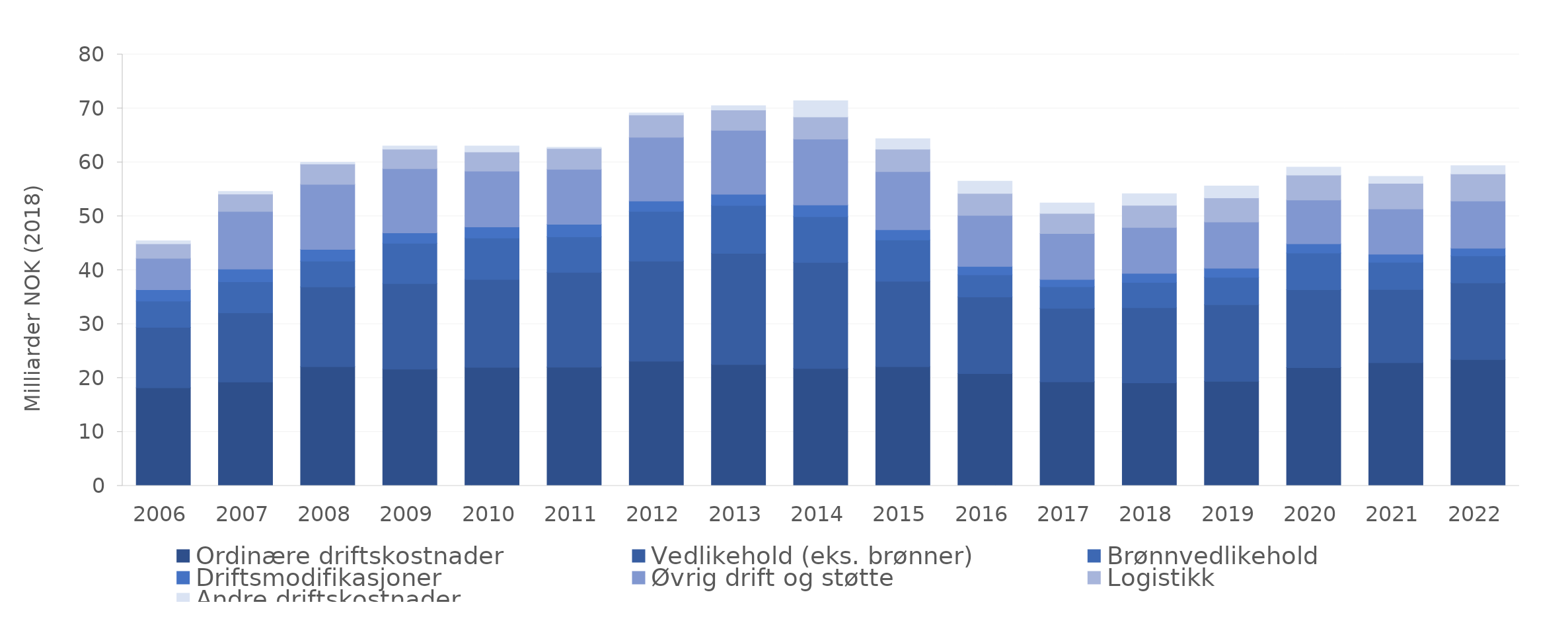
| Category | Ordinære driftskostnader | Vedlikehold (eks. brønner) | Brønnvedlikehold | Driftsmodifikasjoner | Øvrig drift og støtte | Logistikk | Andre driftskostnader |
|---|---|---|---|---|---|---|---|
| 2006.0 | 18.196 | 11.215 | 4.851 | 2.126 | 5.823 | 2.695 | 0.558 |
| 2007.0 | 19.267 | 12.846 | 5.756 | 2.344 | 10.689 | 3.222 | 0.476 |
| 2008.0 | 22.111 | 14.803 | 4.758 | 2.183 | 12.073 | 3.767 | 0.321 |
| 2009.0 | 21.653 | 15.855 | 7.488 | 1.927 | 11.899 | 3.616 | 0.598 |
| 2010.0 | 21.981 | 16.289 | 7.687 | 2.075 | 10.333 | 3.573 | 1.103 |
| 2011.0 | 22.017 | 17.598 | 6.58 | 2.323 | 10.203 | 3.859 | 0.193 |
| 2012.0 | 23.137 | 18.534 | 9.232 | 1.924 | 11.818 | 4.148 | 0.375 |
| 2013.0 | 22.507 | 20.628 | 8.859 | 2.081 | 11.851 | 3.783 | 0.803 |
| 2014.0 | 21.788 | 19.65 | 8.48 | 2.176 | 12.223 | 4.099 | 2.993 |
| 2015.0 | 22.103 | 15.845 | 7.654 | 1.907 | 10.788 | 4.149 | 1.942 |
| 2016.0 | 20.812 | 14.223 | 4.115 | 1.542 | 9.465 | 4.076 | 2.284 |
| 2017.0 | 19.3 | 13.635 | 3.992 | 1.359 | 8.52 | 3.734 | 1.915 |
| 2018.0 | 19.105 | 13.934 | 4.681 | 1.699 | 8.511 | 4.111 | 2.155 |
| 2019.0 | 19.377 | 14.21 | 5.105 | 1.679 | 8.569 | 4.474 | 2.19 |
| 2020.0 | 21.933 | 14.45 | 6.817 | 1.702 | 8.128 | 4.609 | 1.469 |
| 2021.0 | 22.862 | 13.555 | 5.049 | 1.5 | 8.387 | 4.744 | 1.306 |
| 2022.0 | 23.434 | 14.217 | 5.012 | 1.419 | 8.761 | 5.012 | 1.527 |